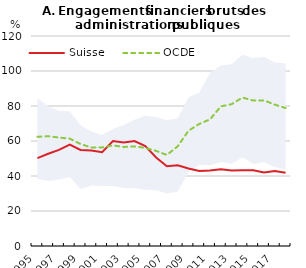
| Category | Suisse | OCDE |
|---|---|---|
| 1995.0 | 50.173 | 62.414 |
| 1996.0 | 52.736 | 62.714 |
| 1997.0 | 54.908 | 61.982 |
| 1998.0 | 57.876 | 61.332 |
| 1999.0 | 54.877 | 58.272 |
| 2000.0 | 54.511 | 56.304 |
| 2001.0 | 53.63 | 56.332 |
| 2002.0 | 59.941 | 57.474 |
| 2003.0 | 59.127 | 56.593 |
| 2004.0 | 59.985 | 56.894 |
| 2005.0 | 57.051 | 56.08 |
| 2006.0 | 50.583 | 54.346 |
| 2007.0 | 45.625 | 52.025 |
| 2008.0 | 46.072 | 56.943 |
| 2009.0 | 44.294 | 65.849 |
| 2010.0 | 42.823 | 69.72 |
| 2011.0 | 43.131 | 72.391 |
| 2012.0 | 43.907 | 79.786 |
| 2013.0 | 43.124 | 81.044 |
| 2014.0 | 43.265 | 84.822 |
| 2015.0 | 43.293 | 83.13 |
| 2016.0 | 42.034 | 83.211 |
| 2017.0 | 42.888 | 80.776 |
| 2018.0 | 41.798 | 78.837 |